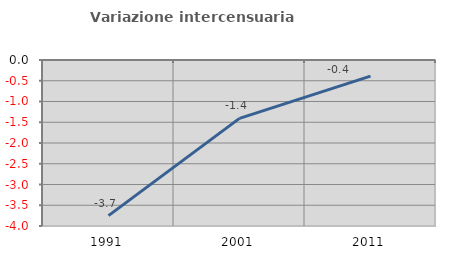
| Category | Variazione intercensuaria annua |
|---|---|
| 1991.0 | -3.75 |
| 2001.0 | -1.407 |
| 2011.0 | -0.387 |